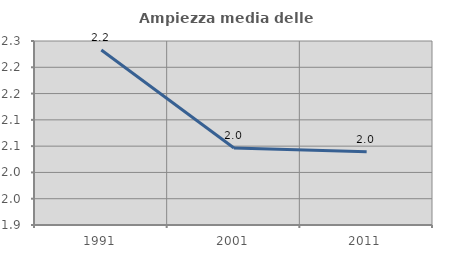
| Category | Ampiezza media delle famiglie |
|---|---|
| 1991.0 | 2.233 |
| 2001.0 | 2.046 |
| 2011.0 | 2.039 |